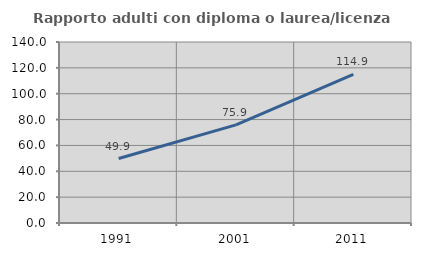
| Category | Rapporto adulti con diploma o laurea/licenza media  |
|---|---|
| 1991.0 | 49.871 |
| 2001.0 | 75.902 |
| 2011.0 | 114.93 |